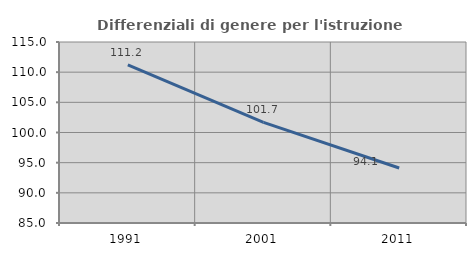
| Category | Differenziali di genere per l'istruzione superiore |
|---|---|
| 1991.0 | 111.19 |
| 2001.0 | 101.668 |
| 2011.0 | 94.115 |